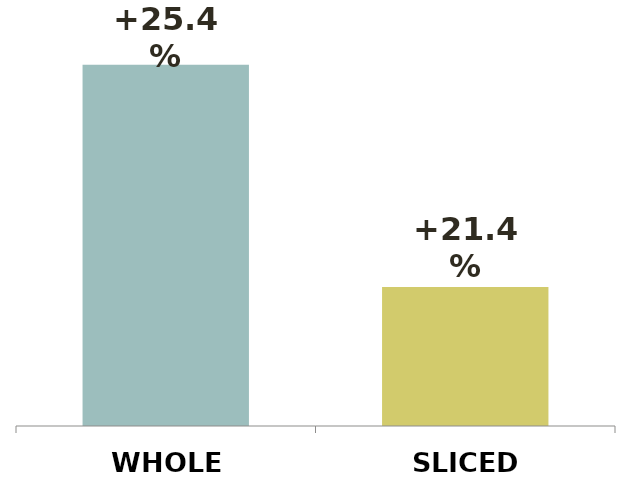
| Category | Series 0 |
|---|---|
| WHOLE | 0.254 |
| SLICED | 0.214 |